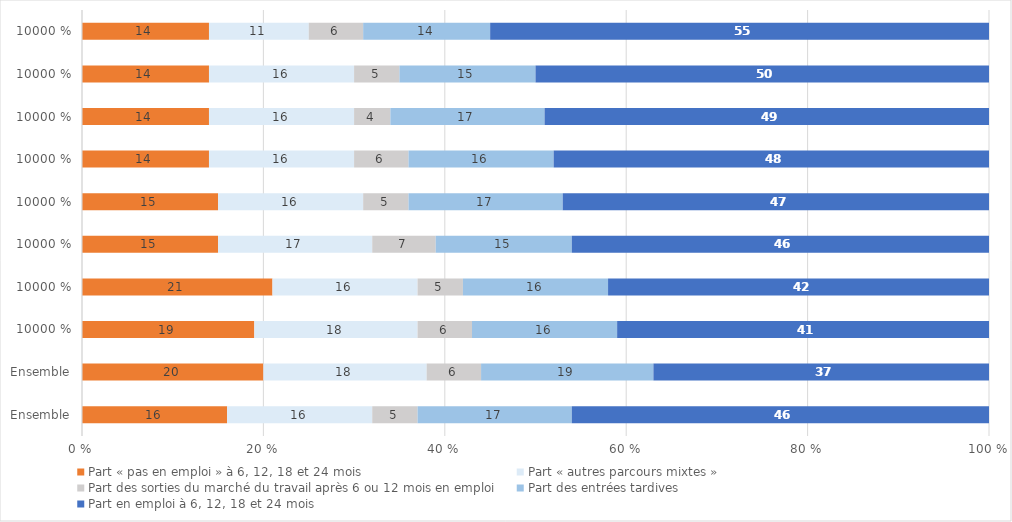
| Category | Part « pas en emploi » à 6, 12, 18 et 24 mois | Part « autres parcours mixtes » | Part des sorties du marché du travail après 6 ou 12 mois en emploi | Part des entrées tardives | Part en emploi à 6, 12, 18 et 24 mois |
|---|---|---|---|---|---|
| Ensemble | 16 | 16 | 5 | 17 | 46 |
| Ensemble | 20 | 18 | 6 | 19 | 37 |
| 100 | 19 | 18 | 6 | 16 | 41 |
| 100 | 21 | 16 | 5 | 16 | 42 |
| 100 | 15 | 17 | 7 | 15 | 46 |
| 100 | 15 | 16 | 5 | 17 | 47 |
| 100 | 14 | 16 | 6 | 16 | 48 |
| 100 | 14 | 16 | 4 | 17 | 49 |
| 100 | 14 | 16 | 5 | 15 | 50 |
| 100 | 14 | 11 | 6 | 14 | 55 |